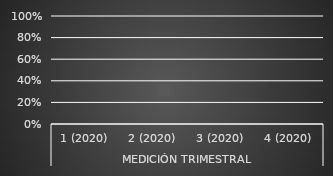
| Category | Series 4 | Series 5 | Series 6 | Series 7 | Series 2 | Series 3 | Series 1 | Series 0 |
|---|---|---|---|---|---|---|---|---|
| 0 | 0 | 0 | 0 | 0 | 0 | 0 | 0 | 0 |
| 1 | 0 | 0 | 0 | 0 | 0 | 0 | 0 | 0 |
| 2 | 0 | 0 | 0 | 0 | 0 | 0 | 0 | 0 |
| 3 | 0 | 0 | 0 | 0 | 0 | 0 | 0 | 0 |